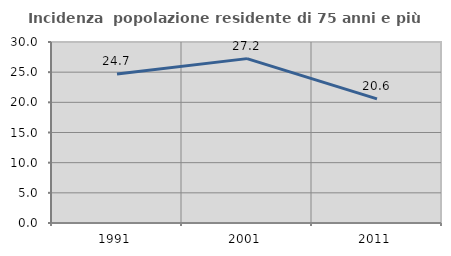
| Category | Incidenza  popolazione residente di 75 anni e più |
|---|---|
| 1991.0 | 24.682 |
| 2001.0 | 27.245 |
| 2011.0 | 20.567 |